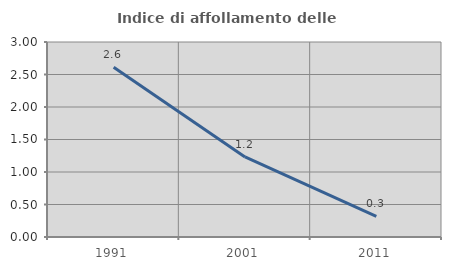
| Category | Indice di affollamento delle abitazioni  |
|---|---|
| 1991.0 | 2.612 |
| 2001.0 | 1.232 |
| 2011.0 | 0.316 |